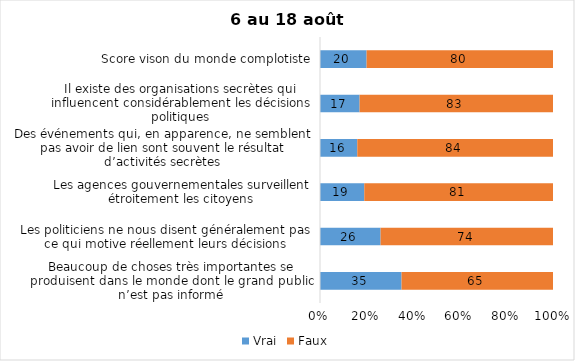
| Category | Vrai | Faux |
|---|---|---|
| Beaucoup de choses très importantes se produisent dans le monde dont le grand public n’est pas informé | 35 | 65 |
| Les politiciens ne nous disent généralement pas ce qui motive réellement leurs décisions | 26 | 74 |
| Les agences gouvernementales surveillent étroitement les citoyens | 19 | 81 |
| Des événements qui, en apparence, ne semblent pas avoir de lien sont souvent le résultat d’activités secrètes | 16 | 84 |
| Il existe des organisations secrètes qui influencent considérablement les décisions politiques | 17 | 83 |
| Score vison du monde complotiste | 20 | 80 |